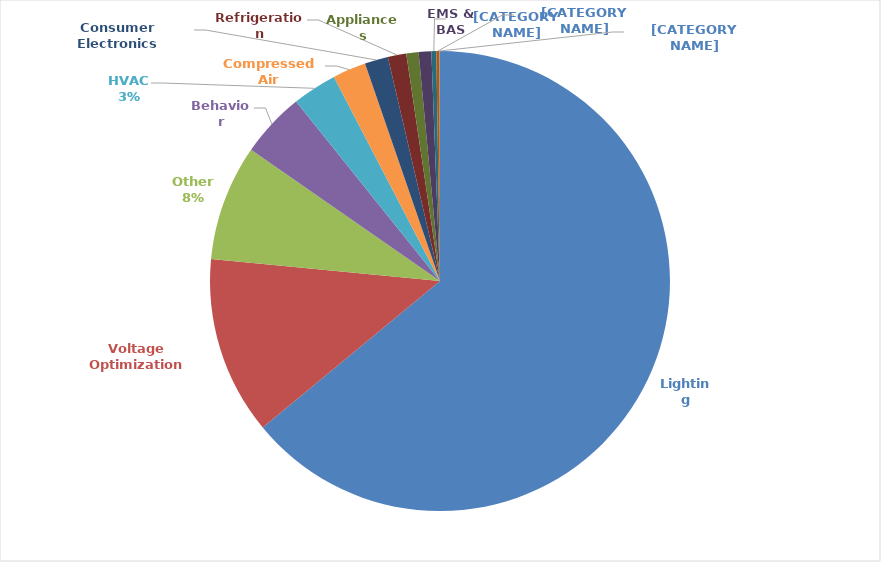
| Category | Series 0 |
|---|---|
| Lighting | 1103684180.202 |
| Voltage Optimization | 215996316.176 |
| Other | 140119487.158 |
| Behavior | 79014638.991 |
| HVAC | 53968413.862 |
| Compressed Air | 40382432.236 |
| Consumer Electronics | 28328315.933 |
| Refrigeration | 22403353.509 |
| Appliances | 14803664.861 |
| EMS & BAS | 15299015.456 |
| Hot Water | 5924505.734 |
| Shell | 3902555.77 |
| Food Service Equipment | 505512.603 |